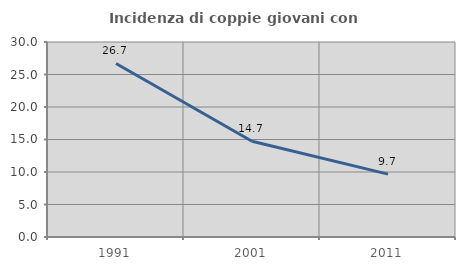
| Category | Incidenza di coppie giovani con figli |
|---|---|
| 1991.0 | 26.693 |
| 2001.0 | 14.738 |
| 2011.0 | 9.676 |